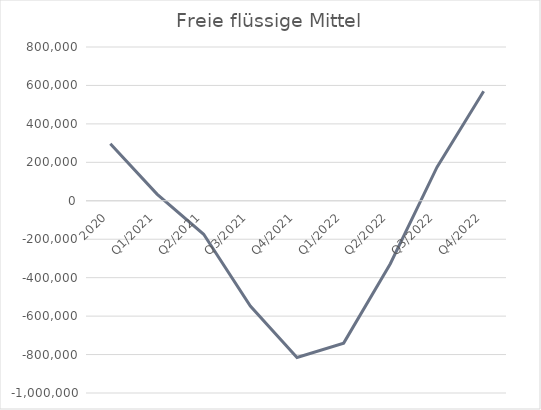
| Category | Series 0 |
|---|---|
| 2020 | 296547 |
| Q1/2021 | 34520.622 |
| Q2/2021 | -174358.729 |
| Q3/2021 | -547580.776 |
| Q4/2021 | -815420.58 |
| Q1/2022 | -740582.04 |
| Q2/2022 | -327676.021 |
| Q3/2022 | 174671.442 |
| Q4/2022 | 570139.936 |